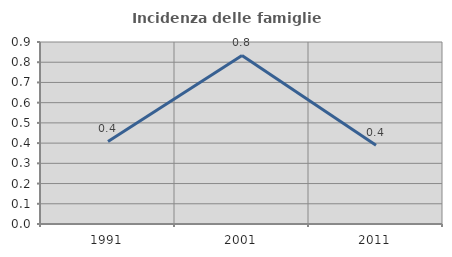
| Category | Incidenza delle famiglie numerose |
|---|---|
| 1991.0 | 0.408 |
| 2001.0 | 0.833 |
| 2011.0 | 0.389 |